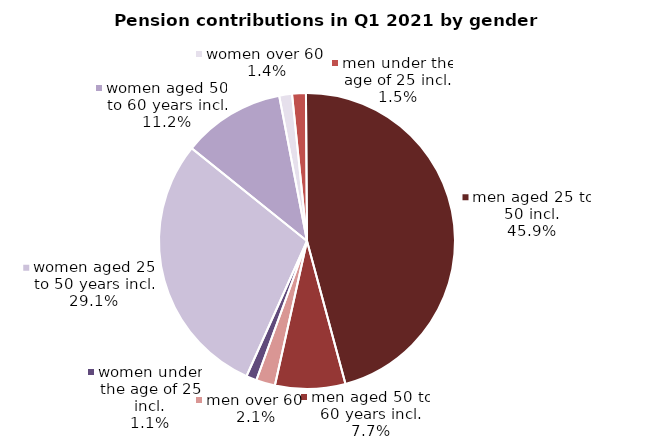
| Category | Series 0 |
|---|---|
| women under the age of 25 incl. | 550637.68 |
| women aged 25 to 50 years incl. | 14007345.74 |
| women aged 50 to 60 years incl. | 5398717.58 |
| women over 60  | 672334.32 |
| men under the age of 25 incl. | 724656.09 |
| men aged 25 to 50 incl. | 22121923.81 |
| men aged 50 to 60 years incl. | 3693720.85 |
| men over 60  | 998767.54 |